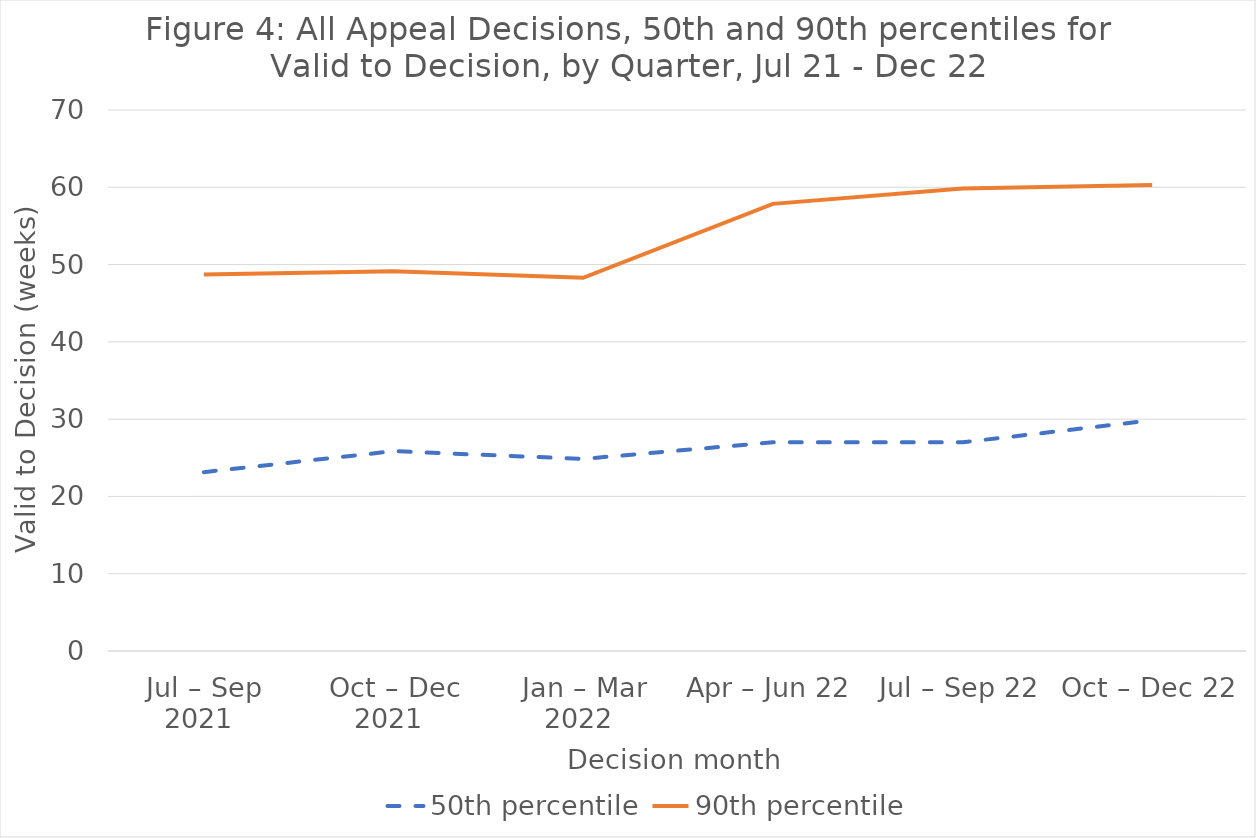
| Category | 50th percentile | 90th percentile |
|---|---|---|
| Jul – Sep 2021  | 23.143 | 48.714 |
| Oct – Dec 2021  | 25.857 | 49.143 |
| Jan – Mar 2022  | 24.857 | 48.286 |
| Apr – Jun 22 | 27 | 57.857 |
| Jul – Sep 22 | 27 | 59.857 |
| Oct – Dec 22 | 29.857 | 60.286 |